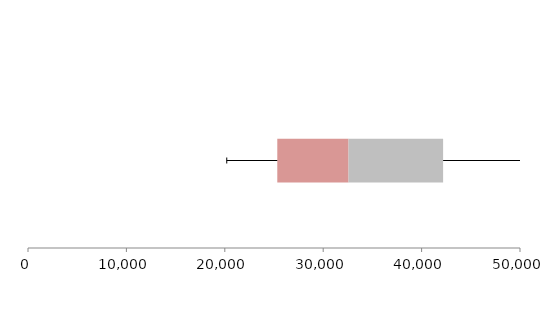
| Category | Series 1 | Series 2 | Series 3 |
|---|---|---|---|
| 0 | 25334.044 | 7240.74 | 9611.473 |